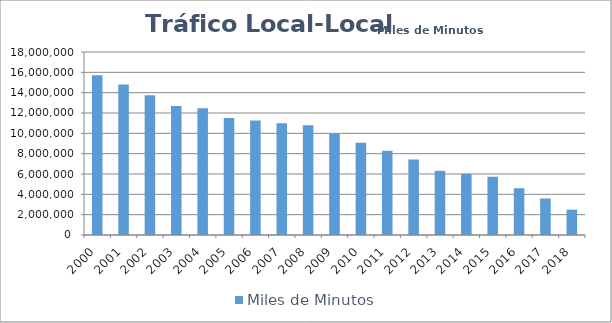
| Category | Miles de Minutos |
|---|---|
| 2000 | 15708021.692 |
| 2001 | 14792112.011 |
| 2002 | 13741512.578 |
| 2003 | 12697840.356 |
| 2004 | 12471681.103 |
| 2005 | 11497364.137 |
| 2006 | 11250082.402 |
| 2007 | 10981107.318 |
| 2008 | 10792163.023 |
| 2009 | 9925576.314 |
| 2010 | 9070767.124 |
| 2011 | 8283065.602 |
| 2012 | 7428037.584 |
| 2013 | 6310456.472 |
| 2014 | 6026527.532 |
| 2015 | 5731826.348 |
| 2016 | 4599625.362 |
| 2017 | 3595888.694 |
| 2018 | 2491247.166 |